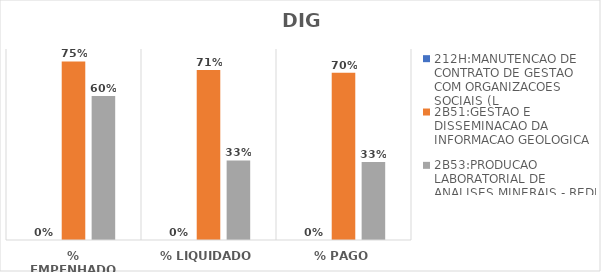
| Category | 212H:MANUTENCAO DE CONTRATO DE GESTAO COM ORGANIZACOES SOCIAIS (L | 2B51:GESTAO E DISSEMINACAO DA INFORMACAO GEOLOGICA | 2B53:PRODUCAO LABORATORIAL DE ANALISES MINERAIS - REDE LAMIN |
|---|---|---|---|
| % EMPENHADO | 0 | 0.748 | 0.603 |
| % LIQUIDADO | 0 | 0.712 | 0.333 |
| % PAGO | 0 | 0.7 | 0.327 |